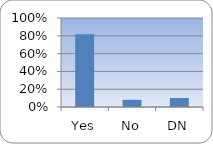
| Category | Series 0 |
|---|---|
| Yes | 0.818 |
| No | 0.081 |
| DN | 0.101 |